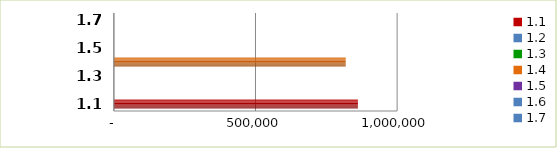
| Category | Series 0 |
|---|---|
| 1.1 | 861554 |
| 1.2 | 0 |
| 1.3 | 0 |
| 1.4 | 818400 |
| 1.5 | 0 |
| 1.6 | 0 |
| 1.7 | 0 |